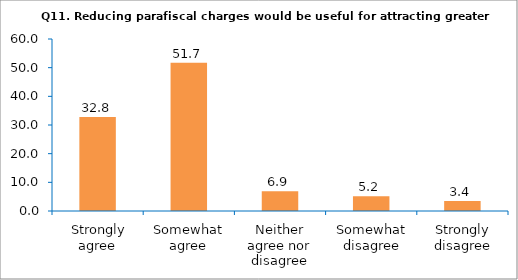
| Category | Series 0 |
|---|---|
|  Strongly agree | 32.759 |
| Somewhat agree | 51.724 |
| Neither agree nor disagree | 6.897 |
| Somewhat disagree | 5.172 |
| Strongly disagree | 3.448 |